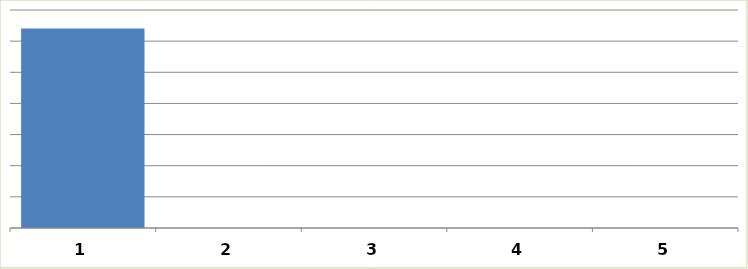
| Category | Series 0 |
|---|---|
| 0 | 1281000 |
| 1 | 0 |
| 2 | 0 |
| 3 | 0 |
| 4 | 0 |